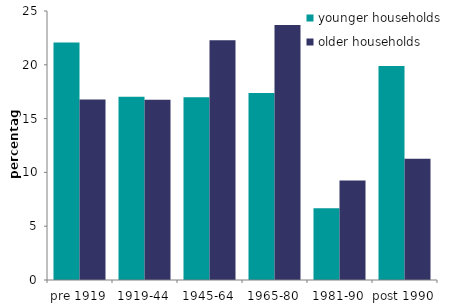
| Category | younger households | older households |
|---|---|---|
| pre 1919 | 22.069 | 16.777 |
| 1919-44 | 17.022 | 16.743 |
| 1945-64 | 16.973 | 22.272 |
| 1965-80 | 17.371 | 23.689 |
| 1981-90 | 6.677 | 9.241 |
| post 1990 | 19.888 | 11.278 |